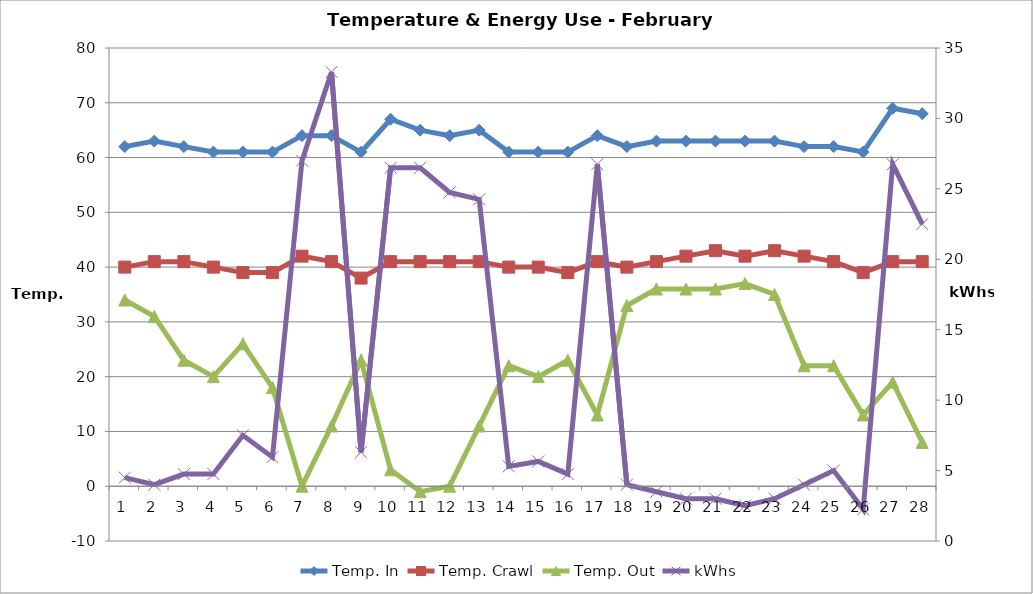
| Category | Temp. In | Temp. Crawl | Temp. Out |
|---|---|---|---|
| 0 | 62 | 40 | 34 |
| 1 | 63 | 41 | 31 |
| 2 | 62 | 41 | 23 |
| 3 | 61 | 40 | 20 |
| 4 | 61 | 39 | 26 |
| 5 | 61 | 39 | 18 |
| 6 | 64 | 42 | 0 |
| 7 | 64 | 41 | 11 |
| 8 | 61 | 38 | 23 |
| 9 | 67 | 41 | 3 |
| 10 | 65 | 41 | -1 |
| 11 | 64 | 41 | 0 |
| 12 | 65 | 41 | 11 |
| 13 | 61 | 40 | 22 |
| 14 | 61 | 40 | 20 |
| 15 | 61 | 39 | 23 |
| 16 | 64 | 41 | 13 |
| 17 | 62 | 40 | 33 |
| 18 | 63 | 41 | 36 |
| 19 | 63 | 42 | 36 |
| 20 | 63 | 43 | 36 |
| 21 | 63 | 42 | 37 |
| 22 | 63 | 43 | 35 |
| 23 | 62 | 42 | 22 |
| 24 | 62 | 41 | 22 |
| 25 | 61 | 39 | 13 |
| 26 | 69 | 41 | 19 |
| 27 | 68 | 41 | 8 |